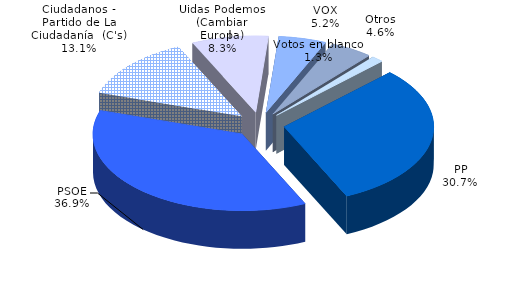
| Category | Series 0 |
|---|---|
| Votos en blanco | 2173 |
| PP | 50124 |
| PSOE | 60229 |
| Ciudadanos - Partido de La Ciudadanía  (C's) | 21359 |
| Uidas Podemos (Cambiar Europa) | 13544 |
| VOX | 8417 |
| Otros | 7511 |